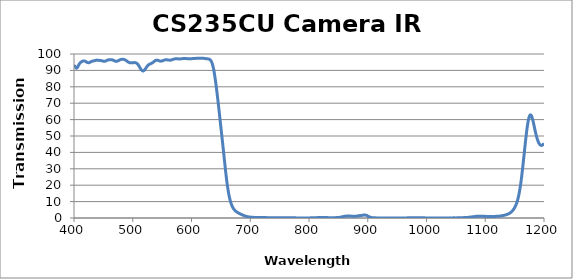
| Category | Transmission (%) |
|---|---|
| 400.0 | 92.726 |
| 401.0 | 92.725 |
| 402.0 | 92.251 |
| 403.0 | 91.693 |
| 404.0 | 91.382 |
| 405.0 | 91.441 |
| 406.0 | 91.915 |
| 407.0 | 92.593 |
| 408.0 | 93.295 |
| 409.0 | 93.913 |
| 410.0 | 94.378 |
| 411.0 | 94.74 |
| 412.0 | 95.024 |
| 413.0 | 95.279 |
| 414.0 | 95.525 |
| 415.0 | 95.663 |
| 416.0 | 95.76 |
| 417.0 | 95.791 |
| 418.0 | 95.704 |
| 419.0 | 95.604 |
| 420.0 | 95.388 |
| 421.0 | 95.181 |
| 422.0 | 94.949 |
| 423.0 | 94.793 |
| 424.0 | 94.719 |
| 425.0 | 94.653 |
| 426.0 | 94.75 |
| 427.0 | 94.898 |
| 428.0 | 95.125 |
| 429.0 | 95.333 |
| 430.0 | 95.464 |
| 431.0 | 95.609 |
| 432.0 | 95.689 |
| 433.0 | 95.793 |
| 434.0 | 95.864 |
| 435.0 | 95.921 |
| 436.0 | 96.03 |
| 437.0 | 96.153 |
| 438.0 | 96.235 |
| 439.0 | 96.274 |
| 440.0 | 96.234 |
| 441.0 | 96.218 |
| 442.0 | 96.163 |
| 443.0 | 96.098 |
| 444.0 | 96.074 |
| 445.0 | 96.027 |
| 446.0 | 95.999 |
| 447.0 | 95.909 |
| 448.0 | 95.819 |
| 449.0 | 95.726 |
| 450.0 | 95.59 |
| 451.0 | 95.557 |
| 452.0 | 95.542 |
| 453.0 | 95.593 |
| 454.0 | 95.74 |
| 455.0 | 95.905 |
| 456.0 | 96.084 |
| 457.0 | 96.221 |
| 458.0 | 96.374 |
| 459.0 | 96.496 |
| 460.0 | 96.503 |
| 461.0 | 96.535 |
| 462.0 | 96.536 |
| 463.0 | 96.559 |
| 464.0 | 96.557 |
| 465.0 | 96.417 |
| 466.0 | 96.328 |
| 467.0 | 96.182 |
| 468.0 | 96.005 |
| 469.0 | 95.858 |
| 470.0 | 95.658 |
| 471.0 | 95.562 |
| 472.0 | 95.536 |
| 473.0 | 95.601 |
| 474.0 | 95.721 |
| 475.0 | 95.831 |
| 476.0 | 96.054 |
| 477.0 | 96.242 |
| 478.0 | 96.393 |
| 479.0 | 96.56 |
| 480.0 | 96.623 |
| 481.0 | 96.71 |
| 482.0 | 96.753 |
| 483.0 | 96.75 |
| 484.0 | 96.732 |
| 485.0 | 96.639 |
| 486.0 | 96.567 |
| 487.0 | 96.389 |
| 488.0 | 96.181 |
| 489.0 | 95.967 |
| 490.0 | 95.661 |
| 491.0 | 95.419 |
| 492.0 | 95.178 |
| 493.0 | 94.954 |
| 494.0 | 94.821 |
| 495.0 | 94.669 |
| 496.0 | 94.632 |
| 497.0 | 94.604 |
| 498.0 | 94.638 |
| 499.0 | 94.699 |
| 500.0 | 94.673 |
| 501.0 | 94.716 |
| 502.0 | 94.737 |
| 503.0 | 94.746 |
| 504.0 | 94.746 |
| 505.0 | 94.614 |
| 506.0 | 94.503 |
| 507.0 | 94.295 |
| 508.0 | 93.969 |
| 509.0 | 93.56 |
| 510.0 | 92.996 |
| 511.0 | 92.428 |
| 512.0 | 91.798 |
| 513.0 | 91.191 |
| 514.0 | 90.633 |
| 515.0 | 90.124 |
| 516.0 | 89.817 |
| 517.0 | 89.655 |
| 518.0 | 89.677 |
| 519.0 | 89.87 |
| 520.0 | 90.178 |
| 521.0 | 90.679 |
| 522.0 | 91.19 |
| 523.0 | 91.734 |
| 524.0 | 92.254 |
| 525.0 | 92.695 |
| 526.0 | 93.136 |
| 527.0 | 93.428 |
| 528.0 | 93.662 |
| 529.0 | 93.861 |
| 530.0 | 93.98 |
| 531.0 | 94.126 |
| 532.0 | 94.291 |
| 533.0 | 94.53 |
| 534.0 | 94.778 |
| 535.0 | 95.031 |
| 536.0 | 95.351 |
| 537.0 | 95.646 |
| 538.0 | 95.924 |
| 539.0 | 96.12 |
| 540.0 | 96.198 |
| 541.0 | 96.264 |
| 542.0 | 96.212 |
| 543.0 | 96.143 |
| 544.0 | 96.01 |
| 545.0 | 95.838 |
| 546.0 | 95.745 |
| 547.0 | 95.683 |
| 548.0 | 95.637 |
| 549.0 | 95.677 |
| 550.0 | 95.745 |
| 551.0 | 95.903 |
| 552.0 | 96.067 |
| 553.0 | 96.211 |
| 554.0 | 96.332 |
| 555.0 | 96.41 |
| 556.0 | 96.49 |
| 557.0 | 96.483 |
| 558.0 | 96.467 |
| 559.0 | 96.422 |
| 560.0 | 96.341 |
| 561.0 | 96.307 |
| 562.0 | 96.266 |
| 563.0 | 96.252 |
| 564.0 | 96.25 |
| 565.0 | 96.294 |
| 566.0 | 96.376 |
| 567.0 | 96.523 |
| 568.0 | 96.651 |
| 569.0 | 96.748 |
| 570.0 | 96.878 |
| 571.0 | 96.978 |
| 572.0 | 97.056 |
| 573.0 | 97.095 |
| 574.0 | 97.068 |
| 575.0 | 97.07 |
| 576.0 | 97.052 |
| 577.0 | 97.045 |
| 578.0 | 97.007 |
| 579.0 | 96.961 |
| 580.0 | 96.988 |
| 581.0 | 97.017 |
| 582.0 | 97.046 |
| 583.0 | 97.062 |
| 584.0 | 97.098 |
| 585.0 | 97.185 |
| 586.0 | 97.225 |
| 587.0 | 97.242 |
| 588.0 | 97.255 |
| 589.0 | 97.249 |
| 590.0 | 97.239 |
| 591.0 | 97.208 |
| 592.0 | 97.173 |
| 593.0 | 97.133 |
| 594.0 | 97.102 |
| 595.0 | 97.094 |
| 596.0 | 97.06 |
| 597.0 | 97.068 |
| 598.0 | 97.088 |
| 599.0 | 97.099 |
| 600.0 | 97.13 |
| 601.0 | 97.158 |
| 602.0 | 97.211 |
| 603.0 | 97.239 |
| 604.0 | 97.248 |
| 605.0 | 97.272 |
| 606.0 | 97.296 |
| 607.0 | 97.333 |
| 608.0 | 97.333 |
| 609.0 | 97.33 |
| 610.0 | 97.356 |
| 611.0 | 97.369 |
| 612.0 | 97.395 |
| 613.0 | 97.4 |
| 614.0 | 97.4 |
| 615.0 | 97.437 |
| 616.0 | 97.448 |
| 617.0 | 97.458 |
| 618.0 | 97.439 |
| 619.0 | 97.401 |
| 620.0 | 97.383 |
| 621.0 | 97.34 |
| 622.0 | 97.297 |
| 623.0 | 97.237 |
| 624.0 | 97.172 |
| 625.0 | 97.151 |
| 626.0 | 97.115 |
| 627.0 | 97.072 |
| 628.0 | 97.027 |
| 629.0 | 96.971 |
| 630.0 | 96.876 |
| 631.0 | 96.682 |
| 632.0 | 96.393 |
| 633.0 | 95.945 |
| 634.0 | 95.293 |
| 635.0 | 94.426 |
| 636.0 | 93.294 |
| 637.0 | 91.846 |
| 638.0 | 90.076 |
| 639.0 | 88.031 |
| 640.0 | 85.735 |
| 641.0 | 83.196 |
| 642.0 | 80.504 |
| 643.0 | 77.653 |
| 644.0 | 74.652 |
| 645.0 | 71.577 |
| 646.0 | 68.423 |
| 647.0 | 65.2 |
| 648.0 | 61.928 |
| 649.0 | 58.663 |
| 650.0 | 55.403 |
| 651.0 | 52.129 |
| 652.0 | 48.868 |
| 653.0 | 45.577 |
| 654.0 | 42.255 |
| 655.0 | 38.888 |
| 656.0 | 35.477 |
| 657.0 | 32.075 |
| 658.0 | 28.76 |
| 659.0 | 25.607 |
| 660.0 | 22.663 |
| 661.0 | 19.976 |
| 662.0 | 17.584 |
| 663.0 | 15.46 |
| 664.0 | 13.587 |
| 665.0 | 11.947 |
| 666.0 | 10.516 |
| 667.0 | 9.288 |
| 668.0 | 8.244 |
| 669.0 | 7.355 |
| 670.0 | 6.609 |
| 671.0 | 5.982 |
| 672.0 | 5.454 |
| 673.0 | 5.004 |
| 674.0 | 4.616 |
| 675.0 | 4.278 |
| 676.0 | 3.976 |
| 677.0 | 3.706 |
| 678.0 | 3.461 |
| 679.0 | 3.238 |
| 680.0 | 3.034 |
| 681.0 | 2.841 |
| 682.0 | 2.659 |
| 683.0 | 2.483 |
| 684.0 | 2.31 |
| 685.0 | 2.142 |
| 686.0 | 1.977 |
| 687.0 | 1.816 |
| 688.0 | 1.659 |
| 689.0 | 1.513 |
| 690.0 | 1.374 |
| 691.0 | 1.245 |
| 692.0 | 1.129 |
| 693.0 | 1.022 |
| 694.0 | 0.926 |
| 695.0 | 0.842 |
| 696.0 | 0.765 |
| 697.0 | 0.697 |
| 698.0 | 0.634 |
| 699.0 | 0.583 |
| 700.0 | 0.539 |
| 701.0 | 0.501 |
| 702.0 | 0.468 |
| 703.0 | 0.436 |
| 704.0 | 0.414 |
| 705.0 | 0.395 |
| 706.0 | 0.378 |
| 707.0 | 0.364 |
| 708.0 | 0.35 |
| 709.0 | 0.341 |
| 710.0 | 0.334 |
| 711.0 | 0.329 |
| 712.0 | 0.325 |
| 713.0 | 0.318 |
| 714.0 | 0.318 |
| 715.0 | 0.318 |
| 716.0 | 0.316 |
| 717.0 | 0.317 |
| 718.0 | 0.312 |
| 719.0 | 0.311 |
| 720.0 | 0.31 |
| 721.0 | 0.304 |
| 722.0 | 0.299 |
| 723.0 | 0.29 |
| 724.0 | 0.282 |
| 725.0 | 0.272 |
| 726.0 | 0.261 |
| 727.0 | 0.249 |
| 728.0 | 0.231 |
| 729.0 | 0.218 |
| 730.0 | 0.206 |
| 731.0 | 0.191 |
| 732.0 | 0.18 |
| 733.0 | 0.165 |
| 734.0 | 0.154 |
| 735.0 | 0.144 |
| 736.0 | 0.135 |
| 737.0 | 0.127 |
| 738.0 | 0.114 |
| 739.0 | 0.11 |
| 740.0 | 0.105 |
| 741.0 | 0.1 |
| 742.0 | 0.098 |
| 743.0 | 0.089 |
| 744.0 | 0.088 |
| 745.0 | 0.087 |
| 746.0 | 0.085 |
| 747.0 | 0.084 |
| 748.0 | 0.082 |
| 749.0 | 0.081 |
| 750.0 | 0.082 |
| 751.0 | 0.082 |
| 752.0 | 0.085 |
| 753.0 | 0.081 |
| 754.0 | 0.083 |
| 755.0 | 0.087 |
| 756.0 | 0.088 |
| 757.0 | 0.093 |
| 758.0 | 0.092 |
| 759.0 | 0.096 |
| 760.0 | 0.099 |
| 761.0 | 0.103 |
| 762.0 | 0.107 |
| 763.0 | 0.106 |
| 764.0 | 0.109 |
| 765.0 | 0.112 |
| 766.0 | 0.112 |
| 767.0 | 0.114 |
| 768.0 | 0.109 |
| 769.0 | 0.11 |
| 770.0 | 0.11 |
| 771.0 | 0.107 |
| 772.0 | 0.106 |
| 773.0 | 0.098 |
| 774.0 | 0.097 |
| 775.0 | 0.093 |
| 776.0 | 0.089 |
| 777.0 | 0.086 |
| 778.0 | 0.077 |
| 779.0 | 0.076 |
| 780.0 | 0.072 |
| 781.0 | 0.068 |
| 782.0 | 0.068 |
| 783.0 | 0.06 |
| 784.0 | 0.06 |
| 785.0 | 0.06 |
| 786.0 | 0.056 |
| 787.0 | 0.056 |
| 788.0 | 0.051 |
| 789.0 | 0.053 |
| 790.0 | 0.053 |
| 791.0 | 0.052 |
| 792.0 | 0.055 |
| 793.0 | 0.05 |
| 794.0 | 0.054 |
| 795.0 | 0.057 |
| 796.0 | 0.057 |
| 797.0 | 0.06 |
| 798.0 | 0.058 |
| 799.0 | 0.063 |
| 800.0 | 0.067 |
| 801.0 | 0.071 |
| 802.0 | 0.078 |
| 803.0 | 0.077 |
| 804.0 | 0.087 |
| 805.0 | 0.096 |
| 806.0 | 0.103 |
| 807.0 | 0.118 |
| 808.0 | 0.124 |
| 809.0 | 0.141 |
| 810.0 | 0.159 |
| 811.0 | 0.177 |
| 812.0 | 0.197 |
| 813.0 | 0.215 |
| 814.0 | 0.24 |
| 815.0 | 0.262 |
| 816.0 | 0.283 |
| 817.0 | 0.305 |
| 818.0 | 0.317 |
| 819.0 | 0.336 |
| 820.0 | 0.347 |
| 821.0 | 0.354 |
| 822.0 | 0.356 |
| 823.0 | 0.35 |
| 824.0 | 0.343 |
| 825.0 | 0.332 |
| 826.0 | 0.318 |
| 827.0 | 0.302 |
| 828.0 | 0.281 |
| 829.0 | 0.267 |
| 830.0 | 0.252 |
| 831.0 | 0.237 |
| 832.0 | 0.227 |
| 833.0 | 0.212 |
| 834.0 | 0.205 |
| 835.0 | 0.201 |
| 836.0 | 0.195 |
| 837.0 | 0.194 |
| 838.0 | 0.187 |
| 839.0 | 0.19 |
| 840.0 | 0.19 |
| 841.0 | 0.194 |
| 842.0 | 0.198 |
| 843.0 | 0.201 |
| 844.0 | 0.214 |
| 845.0 | 0.225 |
| 846.0 | 0.236 |
| 847.0 | 0.253 |
| 848.0 | 0.271 |
| 849.0 | 0.297 |
| 850.0 | 0.329 |
| 851.0 | 0.363 |
| 852.0 | 0.406 |
| 853.0 | 0.453 |
| 854.0 | 0.517 |
| 855.0 | 0.587 |
| 856.0 | 0.667 |
| 857.0 | 0.757 |
| 858.0 | 0.847 |
| 859.0 | 0.938 |
| 860.0 | 1.013 |
| 861.0 | 1.03 |
| 862.0 | 1.078 |
| 863.0 | 1.158 |
| 864.0 | 1.239 |
| 865.0 | 1.221 |
| 866.0 | 1.23 |
| 867.0 | 1.225 |
| 868.0 | 1.244 |
| 869.0 | 1.279 |
| 870.0 | 1.221 |
| 871.0 | 1.18 |
| 872.0 | 1.12 |
| 873.0 | 1.08 |
| 874.0 | 1.054 |
| 875.0 | 0.994 |
| 876.0 | 0.99 |
| 877.0 | 1.008 |
| 878.0 | 1.017 |
| 879.0 | 1.057 |
| 880.0 | 1.085 |
| 881.0 | 1.138 |
| 882.0 | 1.194 |
| 883.0 | 1.261 |
| 884.0 | 1.34 |
| 885.0 | 1.373 |
| 886.0 | 1.429 |
| 887.0 | 1.498 |
| 888.0 | 1.537 |
| 889.0 | 1.576 |
| 890.0 | 1.59 |
| 891.0 | 1.636 |
| 892.0 | 1.711 |
| 893.0 | 1.804 |
| 894.0 | 1.851 |
| 895.0 | 1.83 |
| 896.0 | 1.779 |
| 897.0 | 1.705 |
| 898.0 | 1.599 |
| 899.0 | 1.419 |
| 900.0 | 1.173 |
| 901.0 | 1.001 |
| 902.0 | 0.828 |
| 903.0 | 0.658 |
| 904.0 | 0.517 |
| 905.0 | 0.406 |
| 906.0 | 0.324 |
| 907.0 | 0.238 |
| 908.0 | 0.196 |
| 909.0 | 0.16 |
| 910.0 | 0.15 |
| 911.0 | 0.117 |
| 912.0 | 0.107 |
| 913.0 | 0.117 |
| 914.0 | 0.097 |
| 915.0 | 0.049 |
| 916.0 | 0.068 |
| 917.0 | 0.078 |
| 918.0 | 0.057 |
| 919.0 | 0.033 |
| 920.0 | 0.022 |
| 921.0 | 0.048 |
| 922.0 | 0.042 |
| 923.0 | 0.069 |
| 924.0 | 0.05 |
| 925.0 | 0.025 |
| 926.0 | 0.029 |
| 927.0 | 0.033 |
| 928.0 | 0.038 |
| 929.0 | 0.01 |
| 930.0 | 0.016 |
| 931.0 | 0.024 |
| 932.0 | 0.023 |
| 933.0 | 0.031 |
| 934.0 | 0.045 |
| 935.0 | 0.022 |
| 936.0 | 0.016 |
| 937.0 | 0.027 |
| 938.0 | 0.032 |
| 939.0 | 0.04 |
| 940.0 | 0.016 |
| 941.0 | 0.02 |
| 942.0 | 0.039 |
| 943.0 | 0.036 |
| 944.0 | 0.029 |
| 945.0 | 0.014 |
| 946.0 | 0.012 |
| 947.0 | 0.024 |
| 948.0 | 0.037 |
| 949.0 | 0.022 |
| 950.0 | 0.037 |
| 951.0 | 0.049 |
| 952.0 | 0.037 |
| 953.0 | 0.019 |
| 954.0 | 0.022 |
| 955.0 | 0.019 |
| 956.0 | 0.02 |
| 957.0 | 0.049 |
| 958.0 | 0.05 |
| 959.0 | 0.04 |
| 960.0 | 0.054 |
| 961.0 | 0.055 |
| 962.0 | 0.051 |
| 963.0 | 0.068 |
| 964.0 | 0.043 |
| 965.0 | 0.046 |
| 966.0 | 0.065 |
| 967.0 | 0.075 |
| 968.0 | 0.106 |
| 969.0 | 0.113 |
| 970.0 | 0.103 |
| 971.0 | 0.102 |
| 972.0 | 0.107 |
| 973.0 | 0.105 |
| 974.0 | 0.122 |
| 975.0 | 0.143 |
| 976.0 | 0.158 |
| 977.0 | 0.159 |
| 978.0 | 0.158 |
| 979.0 | 0.165 |
| 980.0 | 0.145 |
| 981.0 | 0.13 |
| 982.0 | 0.154 |
| 983.0 | 0.181 |
| 984.0 | 0.185 |
| 985.0 | 0.169 |
| 986.0 | 0.146 |
| 987.0 | 0.154 |
| 988.0 | 0.135 |
| 989.0 | 0.107 |
| 990.0 | 0.105 |
| 991.0 | 0.125 |
| 992.0 | 0.135 |
| 993.0 | 0.113 |
| 994.0 | 0.076 |
| 995.0 | 0.081 |
| 996.0 | 0.092 |
| 997.0 | 0.079 |
| 998.0 | 0.058 |
| 999.0 | 0.046 |
| 1000.0 | 0.052 |
| 1001.0 | 0.062 |
| 1002.0 | 0.053 |
| 1003.0 | 0.042 |
| 1004.0 | 0.027 |
| 1005.0 | 0.03 |
| 1006.0 | 0.046 |
| 1007.0 | 0.064 |
| 1008.0 | 0.055 |
| 1009.0 | 0.03 |
| 1010.0 | 0.027 |
| 1011.0 | 0.032 |
| 1012.0 | 0.05 |
| 1013.0 | 0.069 |
| 1014.0 | 0.041 |
| 1015.0 | 0.023 |
| 1016.0 | 0.019 |
| 1017.0 | 0.022 |
| 1018.0 | 0.06 |
| 1019.0 | 0.067 |
| 1020.0 | 0.066 |
| 1021.0 | 0.03 |
| 1022.0 | 0.019 |
| 1023.0 | 0.03 |
| 1024.0 | 0.053 |
| 1025.0 | 0.056 |
| 1026.0 | 0.05 |
| 1027.0 | 0.024 |
| 1028.0 | 0.017 |
| 1029.0 | 0.015 |
| 1030.0 | 0.04 |
| 1031.0 | 0.053 |
| 1032.0 | 0.043 |
| 1033.0 | 0.055 |
| 1034.0 | 0.045 |
| 1035.0 | 0.029 |
| 1036.0 | 0.029 |
| 1037.0 | 0.035 |
| 1038.0 | 0.048 |
| 1039.0 | 0.061 |
| 1040.0 | 0.082 |
| 1041.0 | 0.061 |
| 1042.0 | 0.028 |
| 1043.0 | 0.033 |
| 1044.0 | 0.047 |
| 1045.0 | 0.069 |
| 1046.0 | 0.09 |
| 1047.0 | 0.089 |
| 1048.0 | 0.093 |
| 1049.0 | 0.076 |
| 1050.0 | 0.057 |
| 1051.0 | 0.074 |
| 1052.0 | 0.087 |
| 1053.0 | 0.102 |
| 1054.0 | 0.117 |
| 1055.0 | 0.133 |
| 1056.0 | 0.144 |
| 1057.0 | 0.116 |
| 1058.0 | 0.115 |
| 1059.0 | 0.125 |
| 1060.0 | 0.132 |
| 1061.0 | 0.148 |
| 1062.0 | 0.185 |
| 1063.0 | 0.225 |
| 1064.0 | 0.242 |
| 1065.0 | 0.26 |
| 1066.0 | 0.288 |
| 1067.0 | 0.33 |
| 1068.0 | 0.359 |
| 1069.0 | 0.329 |
| 1070.0 | 0.348 |
| 1071.0 | 0.392 |
| 1072.0 | 0.432 |
| 1073.0 | 0.48 |
| 1074.0 | 0.54 |
| 1075.0 | 0.594 |
| 1076.0 | 0.641 |
| 1077.0 | 0.68 |
| 1078.0 | 0.696 |
| 1079.0 | 0.751 |
| 1080.0 | 0.788 |
| 1081.0 | 0.821 |
| 1082.0 | 0.865 |
| 1083.0 | 0.941 |
| 1084.0 | 1.004 |
| 1085.0 | 1.042 |
| 1086.0 | 1.06 |
| 1087.0 | 1.053 |
| 1088.0 | 1.064 |
| 1089.0 | 1.076 |
| 1090.0 | 1.095 |
| 1091.0 | 1.116 |
| 1092.0 | 1.12 |
| 1093.0 | 1.115 |
| 1094.0 | 1.118 |
| 1095.0 | 1.112 |
| 1096.0 | 1.058 |
| 1097.0 | 1.028 |
| 1098.0 | 1.007 |
| 1099.0 | 0.986 |
| 1100.0 | 0.988 |
| 1101.0 | 0.993 |
| 1102.0 | 0.99 |
| 1103.0 | 0.977 |
| 1104.0 | 0.963 |
| 1105.0 | 0.953 |
| 1106.0 | 0.924 |
| 1107.0 | 0.906 |
| 1108.0 | 0.89 |
| 1109.0 | 0.883 |
| 1110.0 | 0.88 |
| 1111.0 | 0.875 |
| 1112.0 | 0.892 |
| 1113.0 | 0.92 |
| 1114.0 | 0.933 |
| 1115.0 | 0.942 |
| 1116.0 | 0.95 |
| 1117.0 | 0.979 |
| 1118.0 | 1.015 |
| 1119.0 | 1.038 |
| 1120.0 | 1.045 |
| 1121.0 | 1.057 |
| 1122.0 | 1.062 |
| 1123.0 | 1.111 |
| 1124.0 | 1.143 |
| 1125.0 | 1.167 |
| 1126.0 | 1.209 |
| 1127.0 | 1.27 |
| 1128.0 | 1.359 |
| 1129.0 | 1.437 |
| 1130.0 | 1.495 |
| 1131.0 | 1.546 |
| 1132.0 | 1.616 |
| 1133.0 | 1.724 |
| 1134.0 | 1.834 |
| 1135.0 | 1.907 |
| 1136.0 | 2.023 |
| 1137.0 | 2.145 |
| 1138.0 | 2.275 |
| 1139.0 | 2.434 |
| 1140.0 | 2.624 |
| 1141.0 | 2.814 |
| 1142.0 | 3.014 |
| 1143.0 | 3.264 |
| 1144.0 | 3.543 |
| 1145.0 | 3.889 |
| 1146.0 | 4.268 |
| 1147.0 | 4.687 |
| 1148.0 | 5.138 |
| 1149.0 | 5.676 |
| 1150.0 | 6.283 |
| 1151.0 | 6.999 |
| 1152.0 | 7.739 |
| 1153.0 | 8.644 |
| 1154.0 | 9.7 |
| 1155.0 | 10.904 |
| 1156.0 | 12.241 |
| 1157.0 | 13.846 |
| 1158.0 | 15.577 |
| 1159.0 | 17.674 |
| 1160.0 | 19.969 |
| 1161.0 | 22.535 |
| 1162.0 | 25.332 |
| 1163.0 | 28.431 |
| 1164.0 | 31.566 |
| 1165.0 | 34.941 |
| 1166.0 | 38.267 |
| 1167.0 | 41.716 |
| 1168.0 | 45.061 |
| 1169.0 | 48.319 |
| 1170.0 | 51.348 |
| 1171.0 | 54.233 |
| 1172.0 | 56.692 |
| 1173.0 | 58.901 |
| 1174.0 | 60.611 |
| 1175.0 | 61.869 |
| 1176.0 | 62.635 |
| 1177.0 | 62.906 |
| 1178.0 | 62.698 |
| 1179.0 | 62.014 |
| 1180.0 | 60.963 |
| 1181.0 | 59.615 |
| 1182.0 | 58.103 |
| 1183.0 | 56.414 |
| 1184.0 | 54.782 |
| 1185.0 | 53.076 |
| 1186.0 | 51.55 |
| 1187.0 | 50.1 |
| 1188.0 | 48.821 |
| 1189.0 | 47.724 |
| 1190.0 | 46.718 |
| 1191.0 | 45.869 |
| 1192.0 | 45.249 |
| 1193.0 | 44.784 |
| 1194.0 | 44.455 |
| 1195.0 | 44.287 |
| 1196.0 | 44.279 |
| 1197.0 | 44.392 |
| 1198.0 | 44.647 |
| 1199.0 | 45.055 |
| 1200.0 | 45.547 |